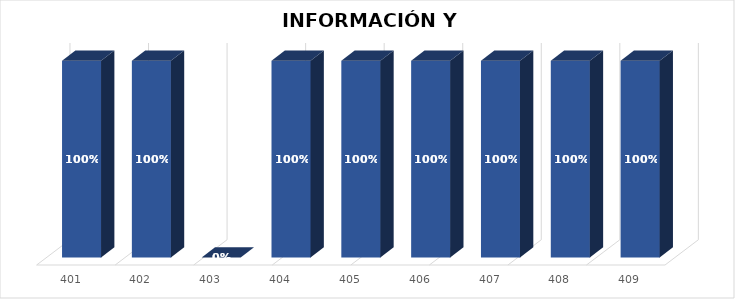
| Category | % Avance |
|---|---|
| 401.0 | 1 |
| 402.0 | 1 |
| 403.0 | 0 |
| 404.0 | 1 |
| 405.0 | 1 |
| 406.0 | 1 |
| 407.0 | 1 |
| 408.0 | 1 |
| 409.0 | 1 |